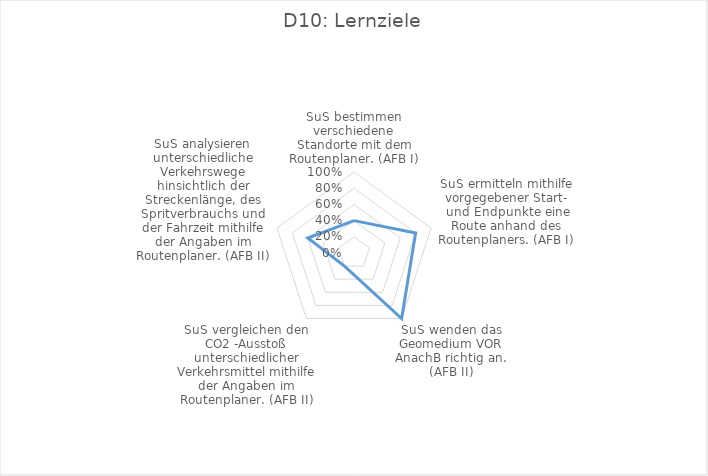
| Category | Prozent |
|---|---|
| SuS bestimmen verschiedene Standorte mit dem Routenplaner. (AFB I) | 0.4 |
| SuS ermitteln mithilfe vorgegebener Start- und Endpunkte eine Route anhand des Routenplaners. (AFB I) | 0.8 |
| SuS wenden das Geomedium VOR AnachB richtig an. (AFB II) | 1 |
| SuS vergleichen den CO2 -Ausstoß unterschiedlicher Verkehrsmittel mithilfe der Angaben im Routenplaner. (AFB II) | 0.2 |
| SuS analysieren unterschiedliche Verkehrswege hinsichtlich der Streckenlänge, des Spritverbrauchs und der Fahrzeit mithilfe der Angaben im Routenplaner. (AFB II) | 0.6 |